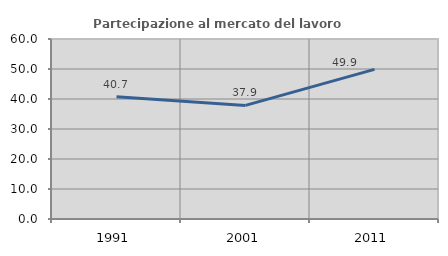
| Category | Partecipazione al mercato del lavoro  femminile |
|---|---|
| 1991.0 | 40.72 |
| 2001.0 | 37.864 |
| 2011.0 | 49.889 |